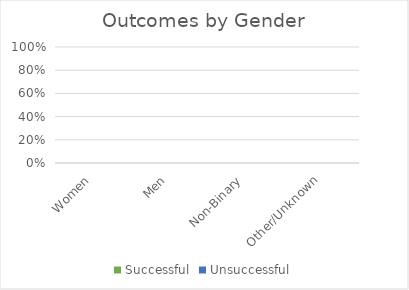
| Category | Successful | Unsuccessful |
|---|---|---|
| Women | 0 | 0 |
| Men | 0 | 0 |
| Non-Binary | 0 | 0 |
| Other/Unknown | 0 | 0 |